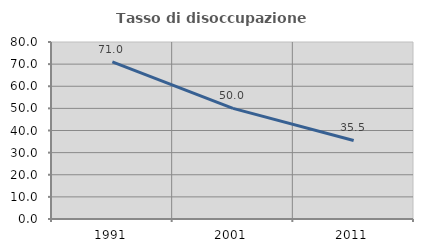
| Category | Tasso di disoccupazione giovanile  |
|---|---|
| 1991.0 | 70.988 |
| 2001.0 | 50 |
| 2011.0 | 35.484 |